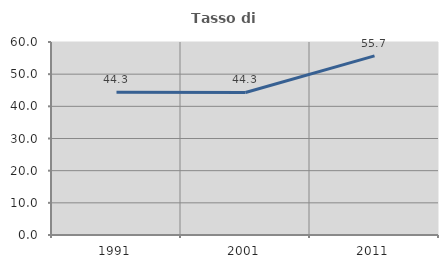
| Category | Tasso di occupazione   |
|---|---|
| 1991.0 | 44.348 |
| 2001.0 | 44.309 |
| 2011.0 | 55.678 |